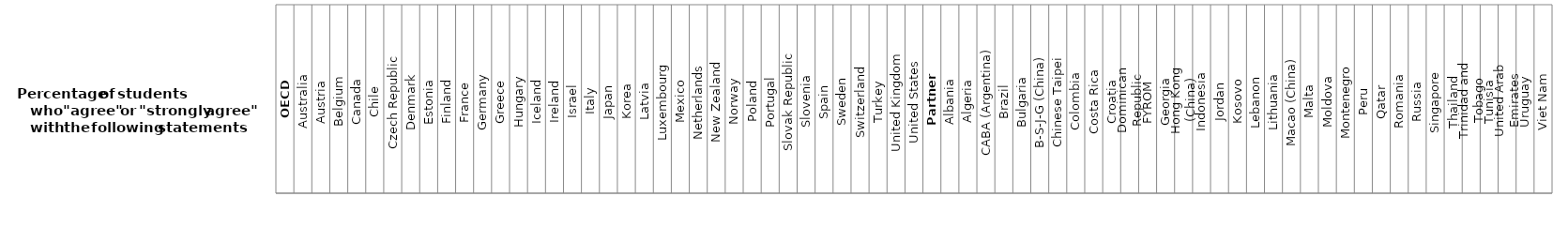
| Category | All countries and economies |
|---|---|
| OECD | 1 |
| Australia | 1 |
| Austria | 1 |
| Belgium | 1 |
| Canada | 1 |
| Chile | 1 |
| Czech Republic | 1 |
| Denmark | 1 |
| Estonia | 1 |
| Finland | 1 |
| France | 1 |
| Germany | 1 |
| Greece | 1 |
| Hungary | 1 |
| Iceland | 1 |
| Ireland | 1 |
| Israel | 1 |
| Italy | 1 |
| Japan | 1 |
| Korea | 1 |
| Latvia | 1 |
| Luxembourg | 1 |
| Mexico | 1 |
| Netherlands | 1 |
| New Zealand | 1 |
| Norway | 1 |
| Poland | 1 |
| Portugal | 1 |
| Slovak Republic | 1 |
| Slovenia | 1 |
| Spain | 1 |
| Sweden | 1 |
| Switzerland | 1 |
| Turkey | 1 |
| United Kingdom | 1 |
| United States | 1 |
| Partners | 1 |
| Albania | 1 |
| Algeria | 1 |
| CABA (Argentina) | 1 |
| Brazil | 1 |
| Bulgaria | 1 |
| B-S-J-G (China) | 1 |
| Chinese Taipei | 1 |
| Colombia | 1 |
| Costa Rica | 1 |
| Croatia | 1 |
| Dominican Republic | 1 |
| FYROM | 1 |
| Georgia | 1 |
| Hong Kong (China) | 1 |
| Indonesia | 1 |
| Jordan | 1 |
| Kosovo | 1 |
| Lebanon | 1 |
| Lithuania | 1 |
| Macao (China) | 1 |
| Malta | 1 |
| Moldova | 1 |
| Montenegro | 1 |
| Peru | 1 |
| Qatar | 1 |
| Romania | 1 |
| Russia | 1 |
| Singapore | 1 |
| Thailand | 1 |
| Trinidad and Tobago | 1 |
| Tunisia | 1 |
| United Arab Emirates | 1 |
| Uruguay | 1 |
| Viet Nam | 1 |